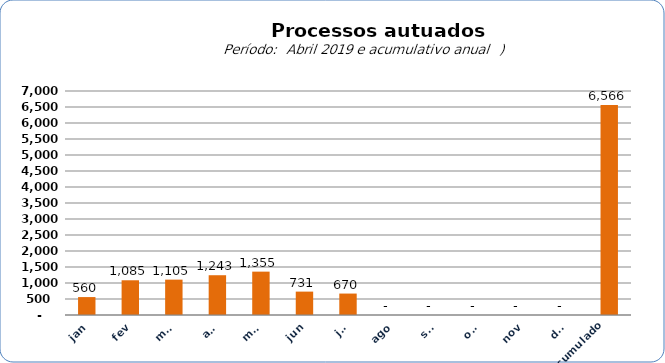
| Category |  6.735   4.276   7.967   6.893   5.569   5.644   6.997   12.080   560   1.085   1.105   1.243   1.355   731   670   -     -     -     -     -     6.566  |
|---|---|
| jan | 560 |
| fev | 1085 |
| mar | 1105 |
| abr | 1243 |
| mai | 1355 |
| jun | 731 |
| jul | 670 |
| ago | 0 |
| set | 0 |
| out | 0 |
| nov | 0 |
| dez | 0 |
| Acumulado
 | 6566 |